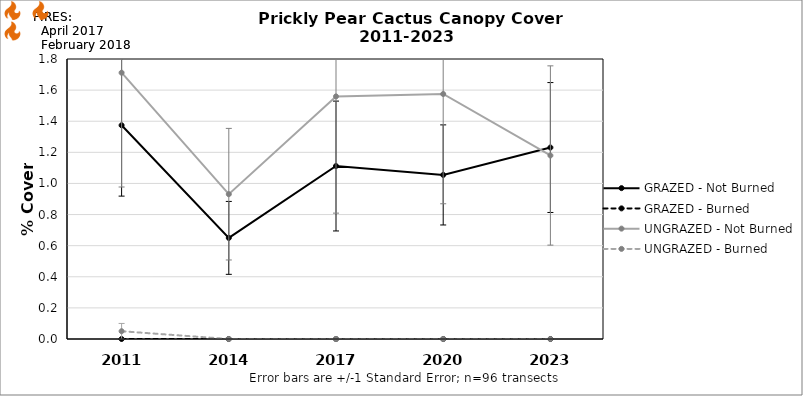
| Category | GRAZED - Not Burned | GRAZED - Burned | UNGRAZED - Not Burned | UNGRAZED - Burned |
|---|---|---|---|---|
| 2011.0 | 1.374 | 0 | 1.712 | 0.05 |
| 2014.0 | 0.65 | 0 | 0.931 | 0 |
| 2017.0 | 1.112 | 0 | 1.56 | 0 |
| 2020.0 | 1.055 | 0 | 1.575 | 0 |
| 2023.0 | 1.231 | 0 | 1.18 | 0 |